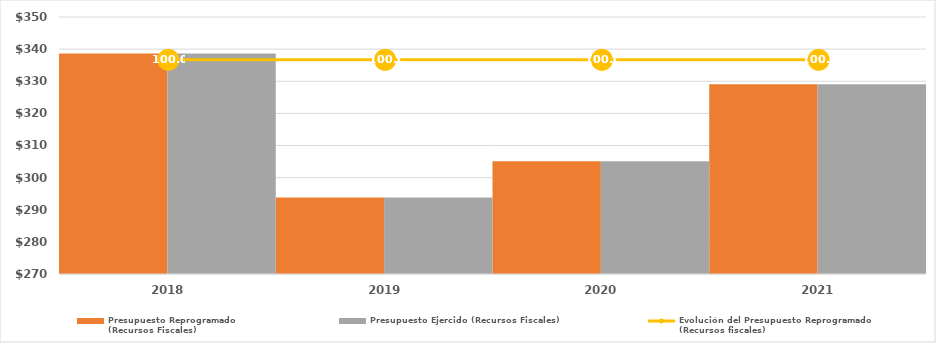
| Category | Presupuesto Reprogramado
(Recursos Fiscales) | Presupuesto Ejercido (Recursos Fiscales) |
|---|---|---|
| 2018.0 | 338675 | 338675 |
| 2019.0 | 293830.853 | 293830.853 |
| 2020.0 | 305075.357 | 305075.357 |
| 2021.0 | 329095.471 | 329095.471 |